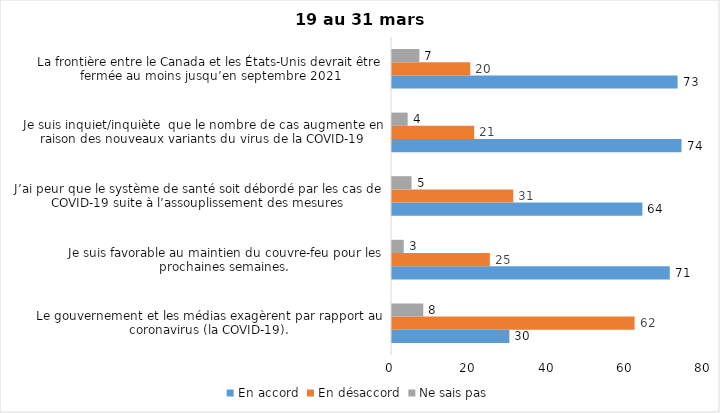
| Category | En accord | En désaccord | Ne sais pas |
|---|---|---|---|
| Le gouvernement et les médias exagèrent par rapport au coronavirus (la COVID-19). | 30 | 62 | 8 |
| Je suis favorable au maintien du couvre-feu pour les prochaines semaines. | 71 | 25 | 3 |
| J’ai peur que le système de santé soit débordé par les cas de COVID-19 suite à l’assouplissement des mesures | 64 | 31 | 5 |
| Je suis inquiet/inquiète  que le nombre de cas augmente en raison des nouveaux variants du virus de la COVID-19 | 74 | 21 | 4 |
| La frontière entre le Canada et les États-Unis devrait être fermée au moins jusqu’en septembre 2021 | 73 | 20 | 7 |